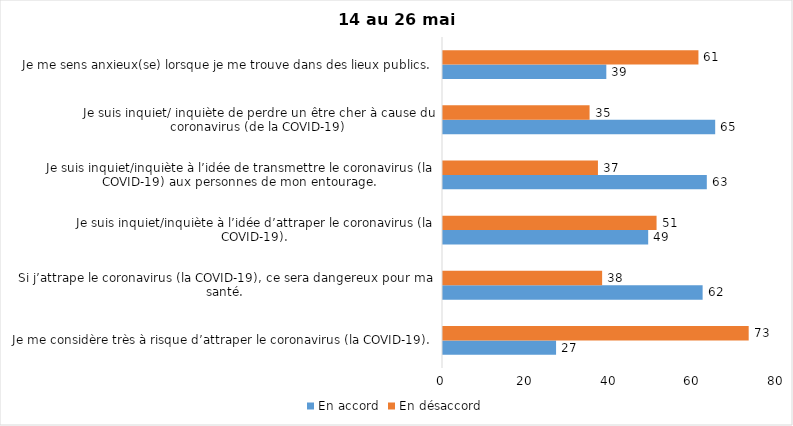
| Category | En accord | En désaccord |
|---|---|---|
| Je me considère très à risque d’attraper le coronavirus (la COVID-19). | 27 | 73 |
| Si j’attrape le coronavirus (la COVID-19), ce sera dangereux pour ma santé. | 62 | 38 |
| Je suis inquiet/inquiète à l’idée d’attraper le coronavirus (la COVID-19). | 49 | 51 |
| Je suis inquiet/inquiète à l’idée de transmettre le coronavirus (la COVID-19) aux personnes de mon entourage. | 63 | 37 |
| Je suis inquiet/ inquiète de perdre un être cher à cause du coronavirus (de la COVID-19) | 65 | 35 |
| Je me sens anxieux(se) lorsque je me trouve dans des lieux publics. | 39 | 61 |